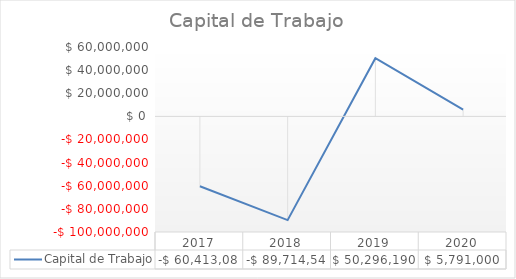
| Category | Capital de Trabajo |
|---|---|
| 2017.0 | -60413088.97 |
| 2018.0 | -89714543.3 |
| 2019.0 | 50296190 |
| 2020.0 | 5791000 |